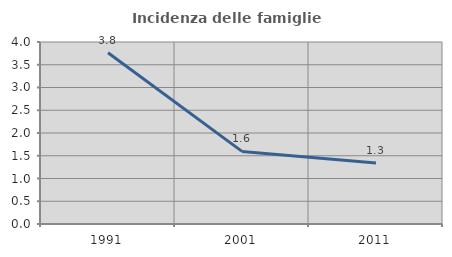
| Category | Incidenza delle famiglie numerose |
|---|---|
| 1991.0 | 3.763 |
| 2001.0 | 1.596 |
| 2011.0 | 1.343 |